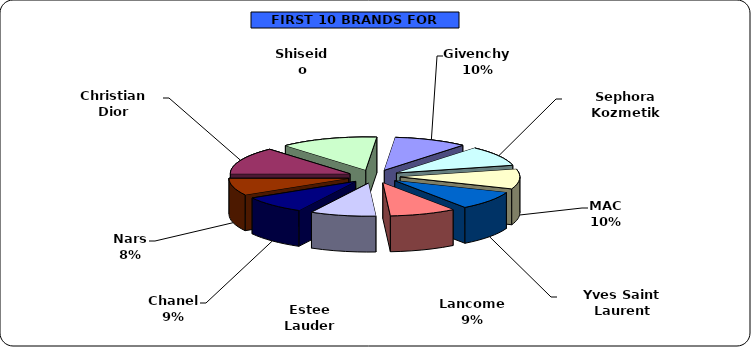
| Category | Series 0 |
|---|---|
| Christian Dior | 17529 |
| Shiseido | 17400 |
| Givenchy | 13069 |
| Sephora Kozmetik | 13006 |
| MAC | 12712 |
| Yves Saint Laurent | 12056 |
| Lancome | 11841 |
| Estee Lauder | 11722 |
| Chanel | 11561 |
| Nars | 11014 |